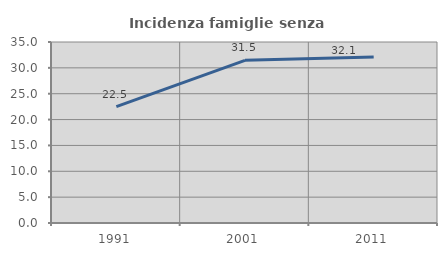
| Category | Incidenza famiglie senza nuclei |
|---|---|
| 1991.0 | 22.491 |
| 2001.0 | 31.45 |
| 2011.0 | 32.099 |